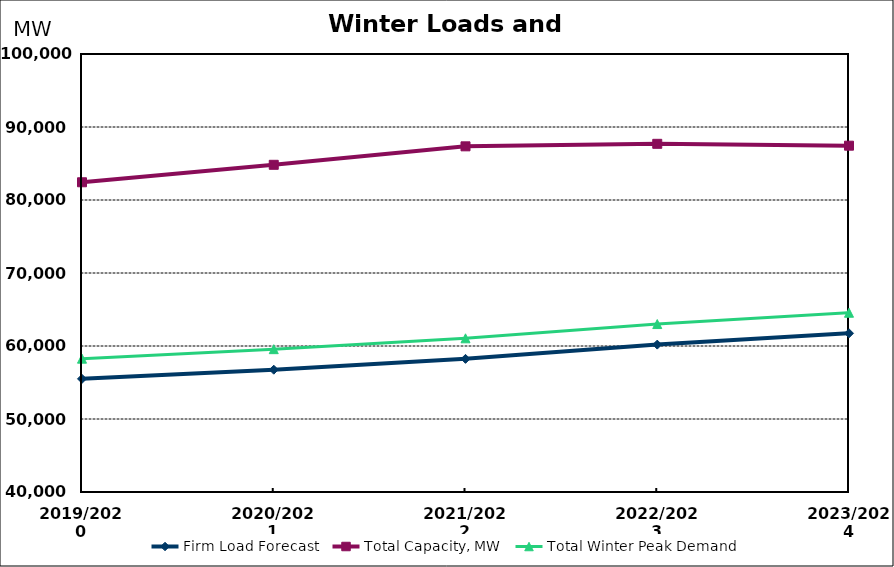
| Category | Firm Load Forecast | Total Capacity, MW | Total Winter Peak Demand |
|---|---|---|---|
| 2019/2020 | 55500.71 | 82428.06 | 58264.691 |
| 2020/2021 | 56751.017 | 84822.269 | 59566.937 |
| 2021/2022 | 58237.366 | 87351.598 | 61053.286 |
| 2022/2023 | 60189.796 | 87695.838 | 63005.716 |
| 2023/2024 | 61741.017 | 87440.838 | 64556.937 |